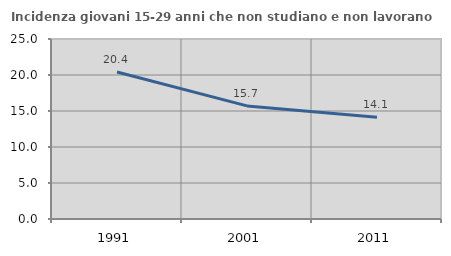
| Category | Incidenza giovani 15-29 anni che non studiano e non lavorano  |
|---|---|
| 1991.0 | 20.426 |
| 2001.0 | 15.71 |
| 2011.0 | 14.122 |